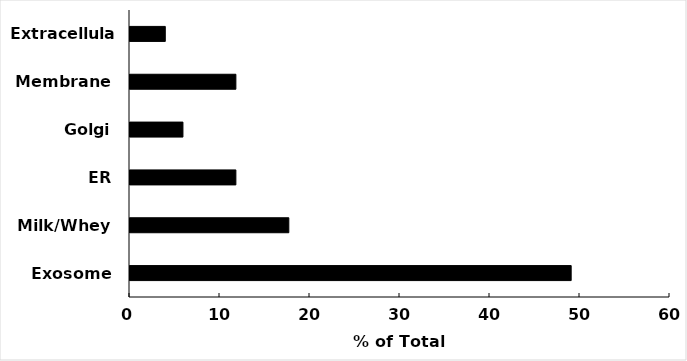
| Category | Series 1 |
|---|---|
| Exosome | 49.02 |
| Milk/Whey | 17.647 |
| ER | 11.765 |
| Golgi | 5.882 |
| Membrane | 11.765 |
| Extracellular | 3.922 |